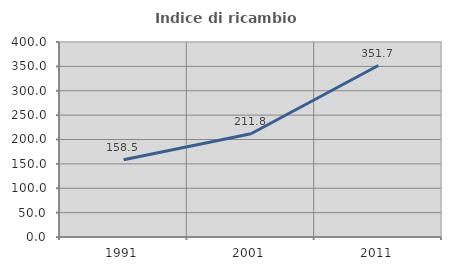
| Category | Indice di ricambio occupazionale  |
|---|---|
| 1991.0 | 158.491 |
| 2001.0 | 211.765 |
| 2011.0 | 351.724 |